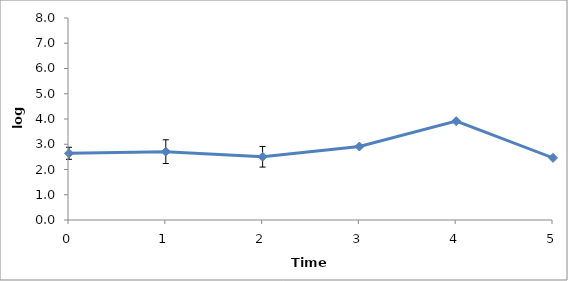
| Category | Time (w) |
|---|---|
| 0.0 | 2.642 |
| 1.0 | 2.707 |
| 2.0 | 2.505 |
| 3.0 | 2.909 |
| 4.0 | 3.915 |
| 5.0 | 2.461 |